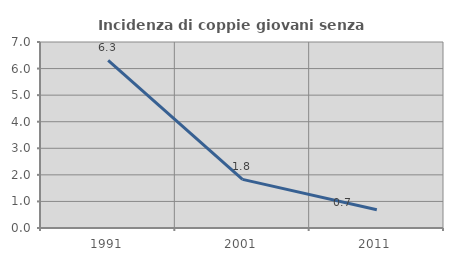
| Category | Incidenza di coppie giovani senza figli |
|---|---|
| 1991.0 | 6.311 |
| 2001.0 | 1.829 |
| 2011.0 | 0.685 |